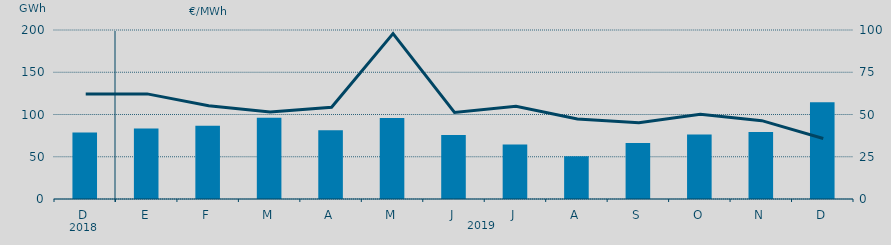
| Category | Energía a subir |
|---|---|
| D | 78.584 |
| E | 83.556 |
| F | 86.827 |
| M | 96.139 |
| A | 81.387 |
| M | 95.806 |
| J | 75.708 |
| J | 64.438 |
| A | 50.596 |
| S | 66.317 |
| O | 76.273 |
| N | 79.309 |
| D | 114.385 |